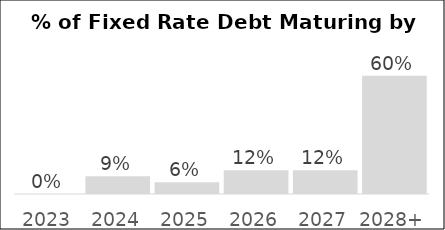
| Category | Series 0 |
|---|---|
| 2023 | 0 |
| 2024 | 0.09 |
| 2025 | 0.06 |
| 2026 | 0.12 |
| 2027 | 0.12 |
| 2028+ | 0.6 |